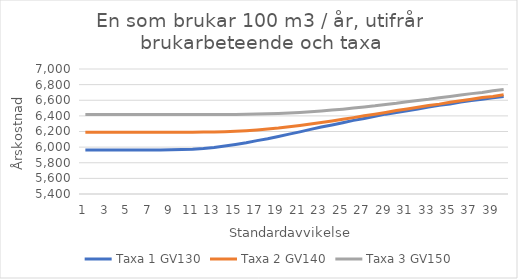
| Category | Taxa 1 GV130 | Taxa 2 GV140 | Taxa 3 GV150 |
|---|---|---|---|
| 0 | 5964.5 | 6191 | 6417.5 |
| 1 | 5964.5 | 6191 | 6417.5 |
| 2 | 5964.5 | 6191 | 6417.5 |
| 3 | 5964.5 | 6191 | 6417.5 |
| 4 | 5964.5 | 6191 | 6417.5 |
| 5 | 5964.5 | 6191 | 6417.5 |
| 6 | 5964.5 | 6191 | 6417.5 |
| 7 | 5964.772 | 6191 | 6417.5 |
| 8 | 5965.799 | 6191 | 6417.5 |
| 9 | 5968.577 | 6191.091 | 6417.5 |
| 10 | 5974.073 | 6191.423 | 6417.5 |
| 11 | 5983.254 | 6192.299 | 6417.5 |
| 12 | 5996.029 | 6194.141 | 6417.681 |
| 13 | 6013.364 | 6197.402 | 6418.044 |
| 14 | 6033.205 | 6202.446 | 6418.799 |
| 15 | 6055.251 | 6209.754 | 6420.127 |
| 16 | 6082.884 | 6219.358 | 6422.453 |
| 17 | 6107.829 | 6230.894 | 6425.714 |
| 18 | 6136.791 | 6243.639 | 6430.395 |
| 19 | 6166.266 | 6259.705 | 6436.254 |
| 20 | 6195.107 | 6277.734 | 6443.653 |
| 21 | 6226.998 | 6294.828 | 6452.532 |
| 22 | 6256.836 | 6314.609 | 6462.8 |
| 23 | 6283.563 | 6334.329 | 6474.155 |
| 24 | 6312.011 | 6356.496 | 6486.205 |
| 25 | 6342.211 | 6377.576 | 6500.339 |
| 26 | 6367.67 | 6400.709 | 6514.623 |
| 27 | 6394.276 | 6421.607 | 6528.425 |
| 28 | 6422.06 | 6444.046 | 6546.514 |
| 29 | 6443.653 | 6468.115 | 6560.829 |
| 30 | 6465.88 | 6488.561 | 6579.674 |
| 31 | 6488.802 | 6510.063 | 6596.828 |
| 32 | 6512.358 | 6532.683 | 6611.565 |
| 33 | 6536.579 | 6550.38 | 6631.256 |
| 34 | 6553.068 | 6574.963 | 6648.107 |
| 35 | 6578.375 | 6594.17 | 6665.925 |
| 36 | 6595.589 | 6614.011 | 6684.8 |
| 37 | 6613.075 | 6634.517 | 6699.628 |
| 38 | 6630.863 | 6648.56 | 6720.315 |
| 39 | 6648.923 | 6670.153 | 6736.563 |